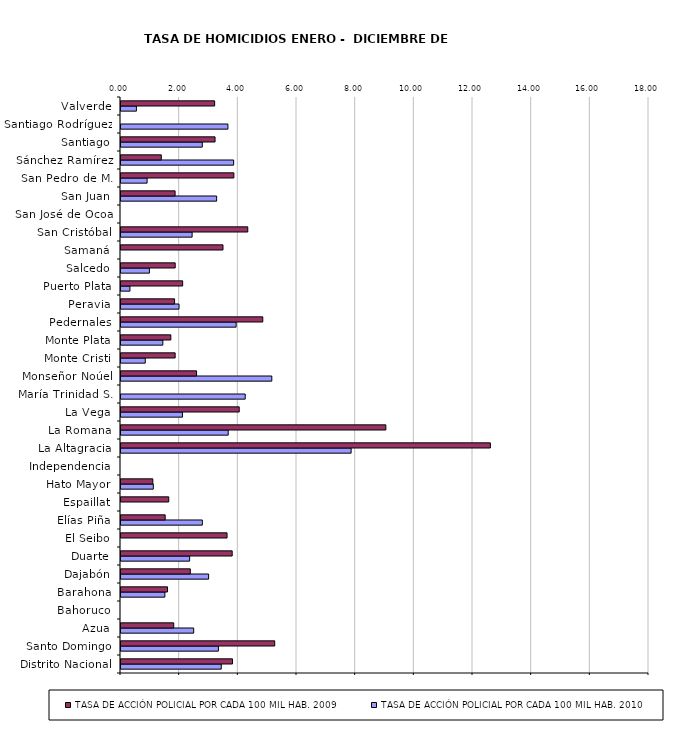
| Category | Series 11 | Series 12 | TASA DE ACCIÓN POLICIAL POR CADA 100 MIL HAB. 2010 | Series 13 | Series 14 | TASA DE ACCIÓN POLICIAL POR CADA 100 MIL HAB. 2009 |
|---|---|---|---|---|---|---|
| Distrito Nacional |  |  | 3.418 |  |  | 3.8 |
| Santo Domingo |  |  | 3.321 |  |  | 5.24 |
| Azua |  |  | 2.478 |  |  | 1.798 |
| Bahoruco |  |  | 0 |  |  | 0 |
| Barahona |  |  | 1.495 |  |  | 1.587 |
| Dajabón |  |  | 2.987 |  |  | 2.363 |
| Duarte |  |  | 2.34 |  |  | 3.791 |
| El Seibo |  |  | 0 |  |  | 3.615 |
| Elías Piña |  |  | 2.773 |  |  | 1.506 |
| Espaillat |  |  | 0 |  |  | 1.628 |
| Hato Mayor |  |  | 1.102 |  |  | 1.085 |
| Independencia |  |  | 0 |  |  | 0 |
| La Altagracia |  |  | 7.846 |  |  | 12.593 |
| La Romana |  |  | 3.655 |  |  | 9.029 |
| La Vega |  |  | 2.095 |  |  | 4.031 |
| María Trinidad S. |  |  | 4.235 |  |  | 0 |
| Monseñor Noúel |  |  | 5.141 |  |  | 2.576 |
| Monte Cristi |  |  | 0.828 |  |  | 1.846 |
| Monte Plata |  |  | 1.426 |  |  | 1.699 |
| Pedernales |  |  | 3.925 |  |  | 4.833 |
| Peravia |  |  | 1.978 |  |  | 1.827 |
| Puerto Plata |  |  | 0.305 |  |  | 2.102 |
| Salcedo |  |  | 0.968 |  |  | 1.848 |
| Samaná |  |  | 0 |  |  | 3.477 |
| San Cristóbal |  |  | 2.424 |  |  | 4.322 |
| San José de Ocoa |  |  | 0 |  |  | 0 |
| San Juan |  |  | 3.26 |  |  | 1.844 |
| San Pedro de M. |  |  | 0.89 |  |  | 3.848 |
| Sánchez Ramírez |  |  | 3.84 |  |  | 1.374 |
| Santiago |  |  | 2.772 |  |  | 3.206 |
| Santiago Rodríguez |  |  | 3.645 |  |  | 0 |
| Valverde |  |  | 0.526 |  |  | 3.193 |